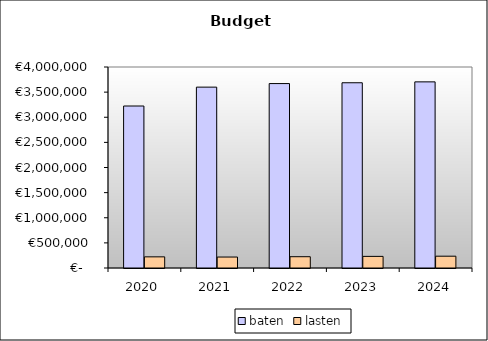
| Category | baten | lasten |
|---|---|---|
| 2020.0 | 3223644.741 | 221756.529 |
| 2021.0 | 3599231.365 | 218099.2 |
| 2022.0 | 3670384.007 | 224529.6 |
| 2023.0 | 3686268.998 | 231070.4 |
| 2024.0 | 3704017.688 | 234912 |